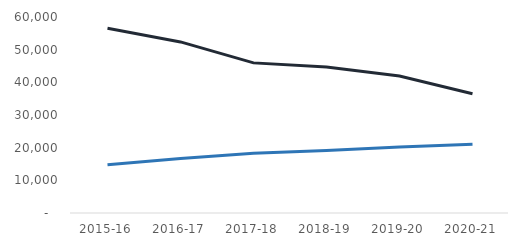
| Category | Open cases 31 March | Approaches |
|---|---|---|
| 2015-16 | 14805 | 56584 |
| 2016-17 | 16695 | 52372 |
| 2017-18 | 18285 | 45953 |
| 2018-19 | 19110 | 44680 |
| 2019-20 | 20235 | 41936 |
| 2020-21 | 21075 | 36514 |